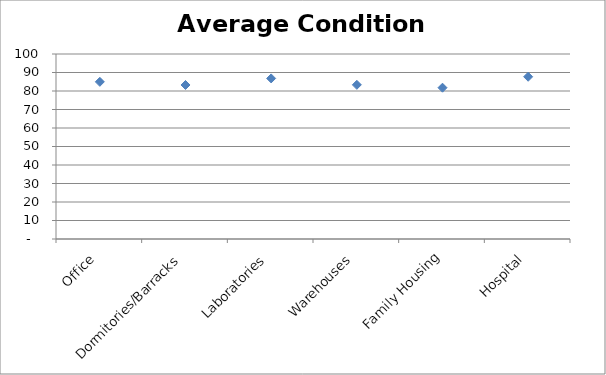
| Category | Average |
|---|---|
| Office | 84.955 |
| Dormitories/Barracks | 83.25 |
| Laboratories | 86.8 |
| Warehouses | 83.333 |
| Family Housing | 81.778 |
| Hospital | 87.7 |